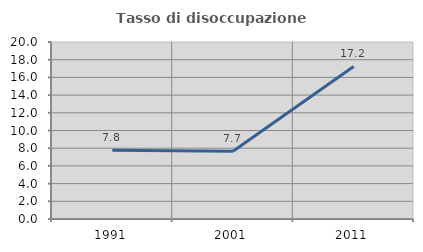
| Category | Tasso di disoccupazione giovanile  |
|---|---|
| 1991.0 | 7.765 |
| 2001.0 | 7.658 |
| 2011.0 | 17.241 |